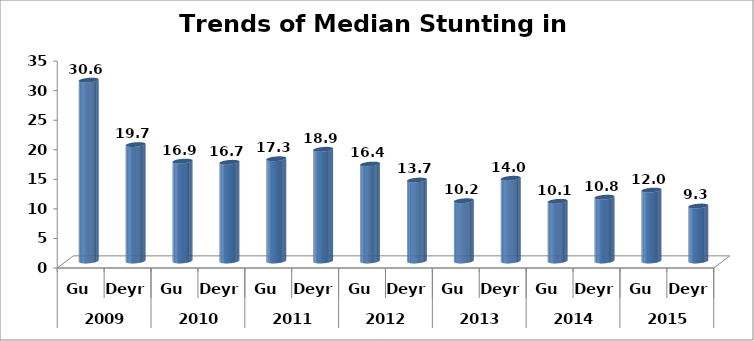
| Category | Series 0 |
|---|---|
| 0 | 30.6 |
| 1 | 19.7 |
| 2 | 16.9 |
| 3 | 16.7 |
| 4 | 17.3 |
| 5 | 18.9 |
| 6 | 16.4 |
| 7 | 13.7 |
| 8 | 10.2 |
| 9 | 14 |
| 10 | 10.1 |
| 11 | 10.8 |
| 12 | 12 |
| 13 | 9.3 |